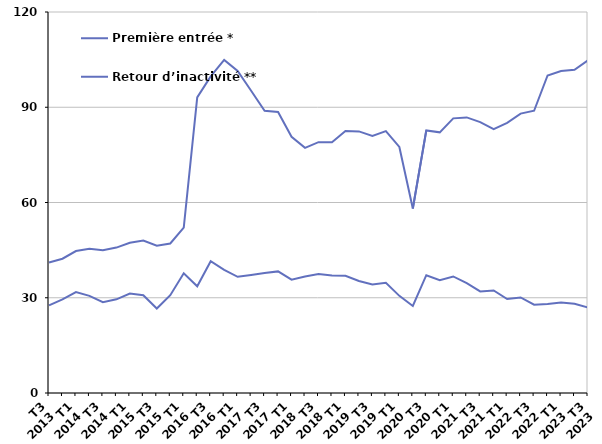
| Category | Première entrée * | Retour d’inactivité ** |
|---|---|---|
| T3
2013 | 27.6 | 41.1 |
| T4
2013 | 29.5 | 42.3 |
| T1
2014 | 31.8 | 44.7 |
| T2
2014 | 30.6 | 45.4 |
| T3
2014 | 28.6 | 45 |
| T4
2014 | 29.5 | 45.8 |
| T1
2015 | 31.3 | 47.3 |
| T2
2015 | 30.8 | 48 |
| T3
2015 | 26.6 | 46.4 |
| T4
2015 | 30.8 | 47.1 |
| T1
2016 | 37.7 | 52.1 |
| T2
2016 | 33.6 | 93.1 |
| T3
2016 | 41.5 | 99.7 |
| T4
2016 | 38.8 | 104.9 |
| T1
2017 | 36.6 | 101.4 |
| T2
2017 | 37.2 | 95.2 |
| T3
2017 | 37.8 | 88.9 |
| T4
2017 | 38.3 | 88.5 |
| T1
2018 | 35.7 | 80.7 |
| T2
2018 | 36.7 | 77.2 |
| T3
2018 | 37.5 | 79 |
| T4
2018 | 37 | 79 |
| T1
2019 | 36.9 | 82.5 |
| T2
2019 | 35.3 | 82.4 |
| T3
2019 | 34.2 | 81 |
| T4
2019 | 34.7 | 82.5 |
| T1
2020 | 30.6 | 77.5 |
| T2
2020 | 27.4 | 58.1 |
| T3
2020 | 37.1 | 82.7 |
| T4
2020 | 35.5 | 82.1 |
| T1
2021 | 36.7 | 86.5 |
| T2
2021 | 34.6 | 86.8 |
| T3
2021 | 32 | 85.3 |
| T4
2021 | 32.3 | 83.1 |
| T1
2022 | 29.6 | 85.1 |
| T2
2022 | 30.1 | 88 |
| T3
2022 | 27.8 | 88.9 |
| T4
2022 | 28 | 100 |
| T1
2023 | 28.5 | 101.4 |
| T2
2023 | 28.1 | 101.8 |
| T3
2023 | 26.9 | 104.8 |